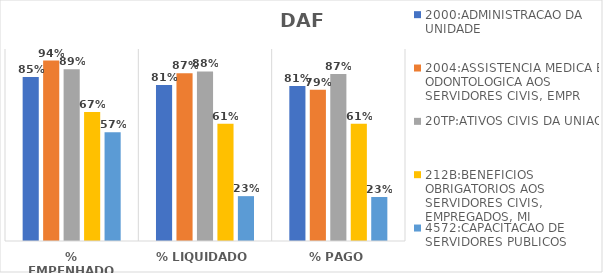
| Category | 2000:ADMINISTRACAO DA UNIDADE | 2004:ASSISTENCIA MEDICA E ODONTOLOGICA AOS SERVIDORES CIVIS, EMPR | 20TP:ATIVOS CIVIS DA UNIAO | 212B:BENEFICIOS OBRIGATORIOS AOS SERVIDORES CIVIS, EMPREGADOS, MI | 4572:CAPACITACAO DE SERVIDORES PUBLICOS FEDERAIS EM PROCESSO DE Q |
|---|---|---|---|---|---|
| % EMPENHADO | 0.854 | 0.94 | 0.895 | 0.672 | 0.567 |
| % LIQUIDADO | 0.812 | 0.874 | 0.883 | 0.611 | 0.234 |
| % PAGO | 0.807 | 0.787 | 0.869 | 0.611 | 0.229 |